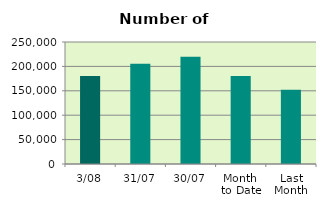
| Category | Series 0 |
|---|---|
| 3/08 | 180200 |
| 31/07 | 205536 |
| 30/07 | 219632 |
| Month 
to Date | 180200 |
| Last
Month | 152026.87 |